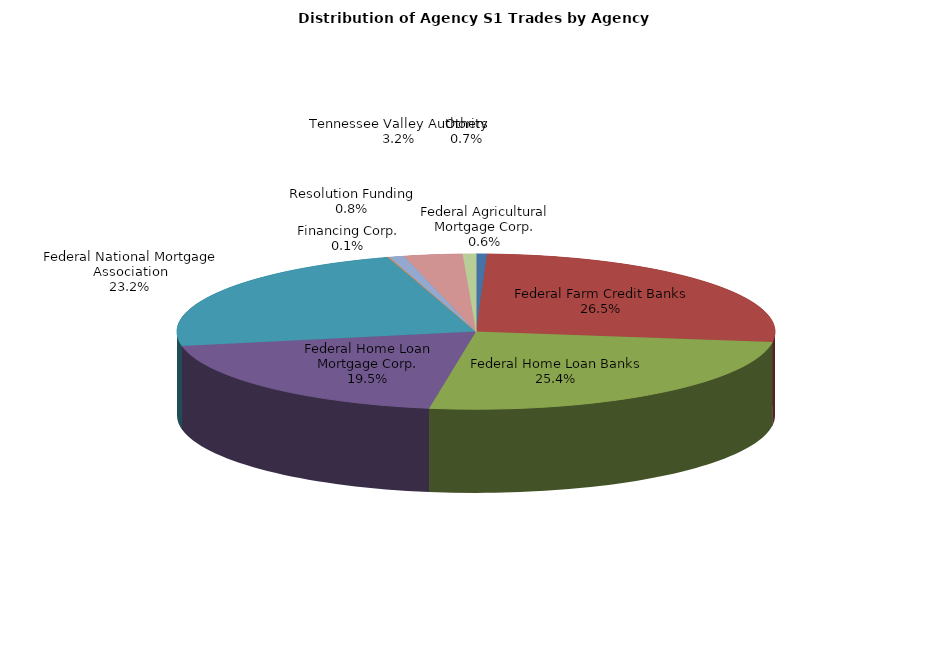
| Category | Series 0 |
|---|---|
| Federal Agricultural Mortgage Corp. | 12.341 |
| Federal Farm Credit Banks | 557.73 |
| Federal Home Loan Banks | 533.238 |
| Federal Home Loan Mortgage Corp. | 410.448 |
| Federal National Mortgage Association | 487.504 |
| Financing Corp. | 1.548 |
| Resolution Funding | 17.361 |
| Tennessee Valley Authority | 66.302 |
| Others | 15.044 |